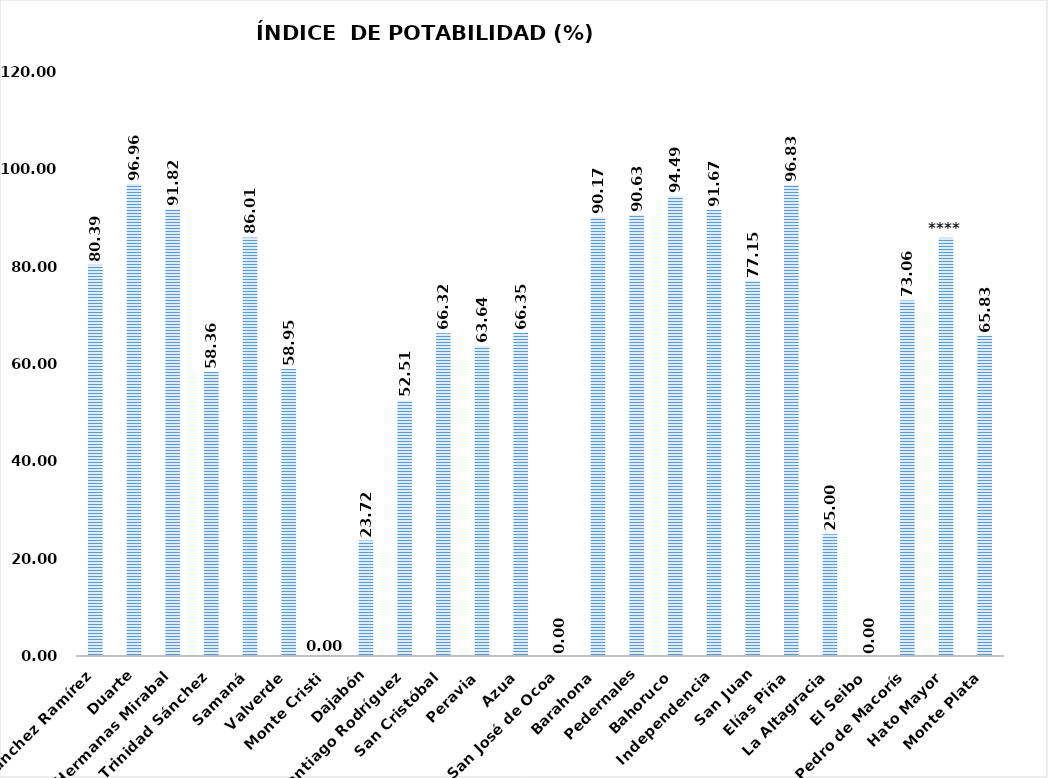
| Category | 80.39  |
|---|---|
| Sánchez Ramírez | 80.388 |
| Duarte | 96.962 |
| Hermanas Mirabal | 91.822 |
| María Trinidad Sánchez | 58.356 |
| Samaná | 86.013 |
| Valverde | 58.949 |
| Monte Cristi | 0 |
| Dajabón | 23.718 |
| Santiago Rodríguez | 52.505 |
| San Cristóbal | 66.317 |
| Peravia | 63.64 |
| Azua | 66.348 |
| San José de Ocoa | 0 |
| Barahona | 90.173 |
| Pedernales | 90.625 |
| Bahoruco | 94.486 |
| Independencia | 91.667 |
| San Juan | 77.147 |
| Elías Piña | 96.825 |
| La Altagracia | 25 |
| El Seibo | 0 |
| San Pedro de Macorís | 73.062 |
| Hato Mayor | 85.948 |
| Monte Plata | 65.832 |